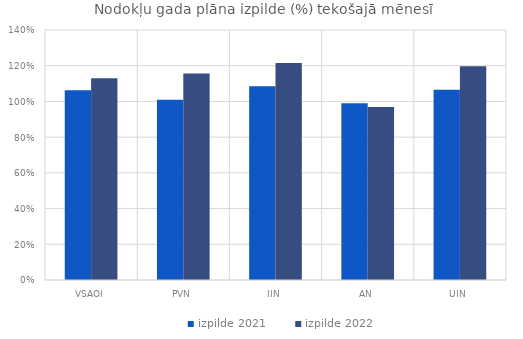
| Category | izpilde 2021 | izpilde 2022 |
|---|---|---|
| VSAOI | 1.062 | 1.13 |
| PVN | 1.01 | 1.157 |
| IIN | 1.084 | 1.215 |
| AN | 0.99 | 0.969 |
| UIN | 1.065 | 1.197 |